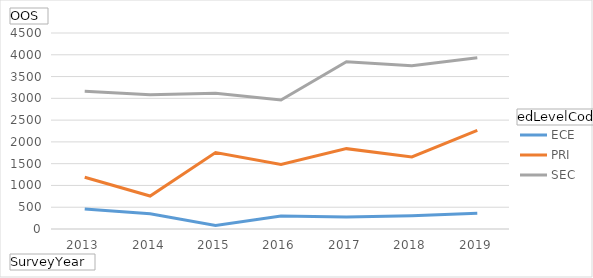
| Category | ECE | PRI | SEC |
|---|---|---|---|
| 2013 | 460 | 1187 | 3163 |
| 2014 | 350 | 757 | 3085 |
| 2015 | 79 | 1756 | 3114 |
| 2016 | 297 | 1481 | 2962 |
| 2017 | 276 | 1845 | 3842 |
| 2018 | 307 | 1654 | 3746 |
| 2019 | 361 | 2266 | 3930 |